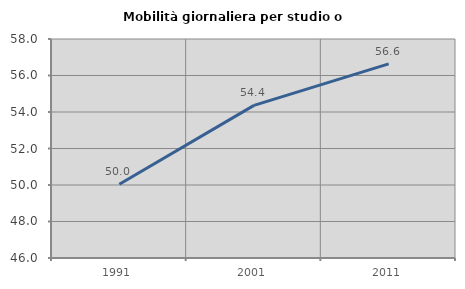
| Category | Mobilità giornaliera per studio o lavoro |
|---|---|
| 1991.0 | 50.044 |
| 2001.0 | 54.362 |
| 2011.0 | 56.639 |